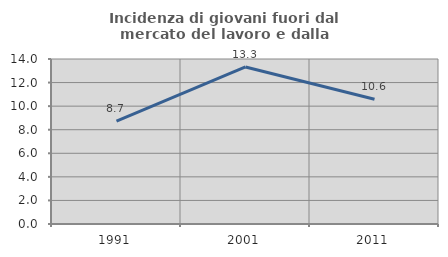
| Category | Incidenza di giovani fuori dal mercato del lavoro e dalla formazione  |
|---|---|
| 1991.0 | 8.729 |
| 2001.0 | 13.325 |
| 2011.0 | 10.581 |